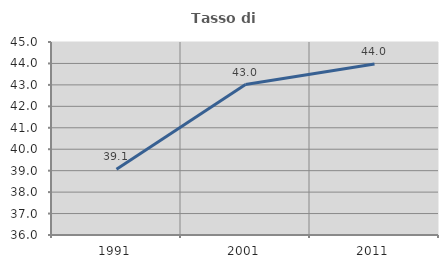
| Category | Tasso di occupazione   |
|---|---|
| 1991.0 | 39.062 |
| 2001.0 | 43.014 |
| 2011.0 | 43.976 |